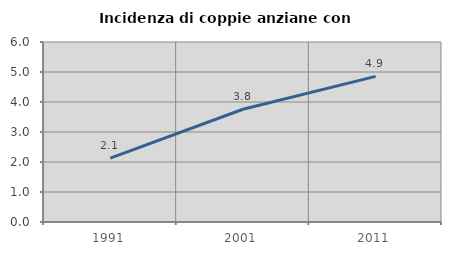
| Category | Incidenza di coppie anziane con figli |
|---|---|
| 1991.0 | 2.13 |
| 2001.0 | 3.759 |
| 2011.0 | 4.854 |